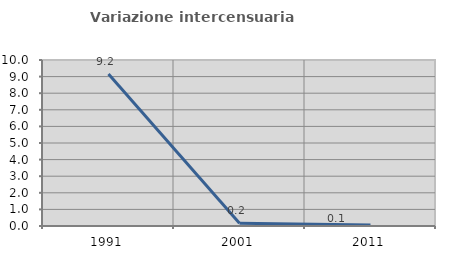
| Category | Variazione intercensuaria annua |
|---|---|
| 1991.0 | 9.157 |
| 2001.0 | 0.163 |
| 2011.0 | 0.055 |